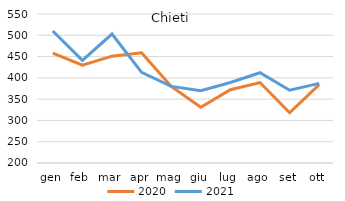
| Category | 2020 | 2021 |
|---|---|---|
| gen | 458 | 510 |
| feb | 430 | 441 |
| mar | 451 | 503 |
| apr | 459 | 413 |
| mag | 380 | 380 |
| giu | 331 | 370 |
| lug | 372 | 389 |
| ago | 389 | 412 |
| set | 318 | 371 |
| ott | 384 | 387 |